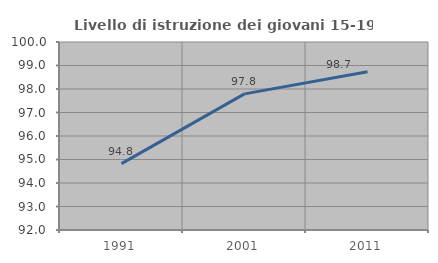
| Category | Livello di istruzione dei giovani 15-19 anni |
|---|---|
| 1991.0 | 94.825 |
| 2001.0 | 97.793 |
| 2011.0 | 98.735 |